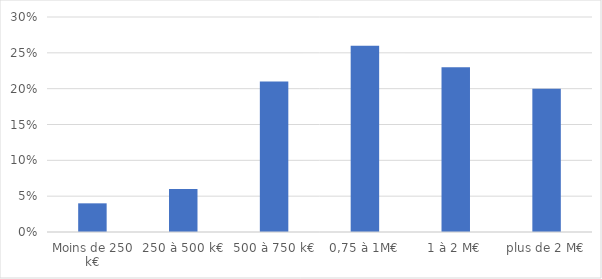
| Category | Series 0 |
|---|---|
| Moins de 250 k€ | 0.04 |
| 250 à 500 k€ | 0.06 |
| 500 à 750 k€ | 0.21 |
| 0,75 à 1M€ | 0.26 |
| 1 à 2 M€ | 0.23 |
| plus de 2 M€ | 0.2 |